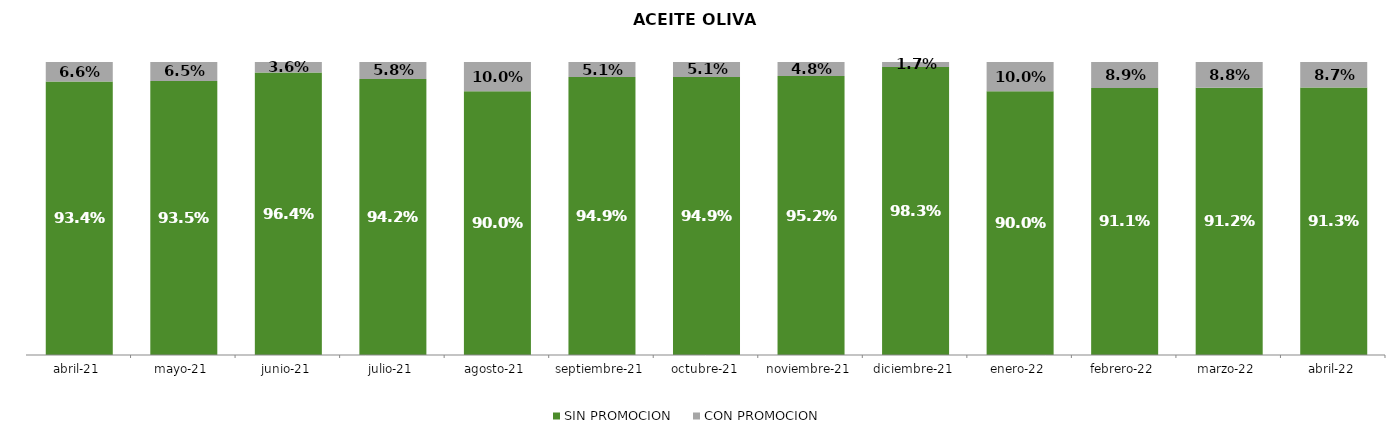
| Category | SIN PROMOCION   | CON PROMOCION   |
|---|---|---|
| 2021-04-01 | 0.934 | 0.066 |
| 2021-05-01 | 0.935 | 0.065 |
| 2021-06-01 | 0.964 | 0.036 |
| 2021-07-01 | 0.942 | 0.058 |
| 2021-08-01 | 0.9 | 0.1 |
| 2021-09-01 | 0.949 | 0.051 |
| 2021-10-01 | 0.949 | 0.051 |
| 2021-11-01 | 0.952 | 0.048 |
| 2021-12-01 | 0.983 | 0.017 |
| 2022-01-01 | 0.9 | 0.1 |
| 2022-02-01 | 0.911 | 0.089 |
| 2022-03-01 | 0.912 | 0.088 |
| 2022-04-01 | 0.913 | 0.087 |